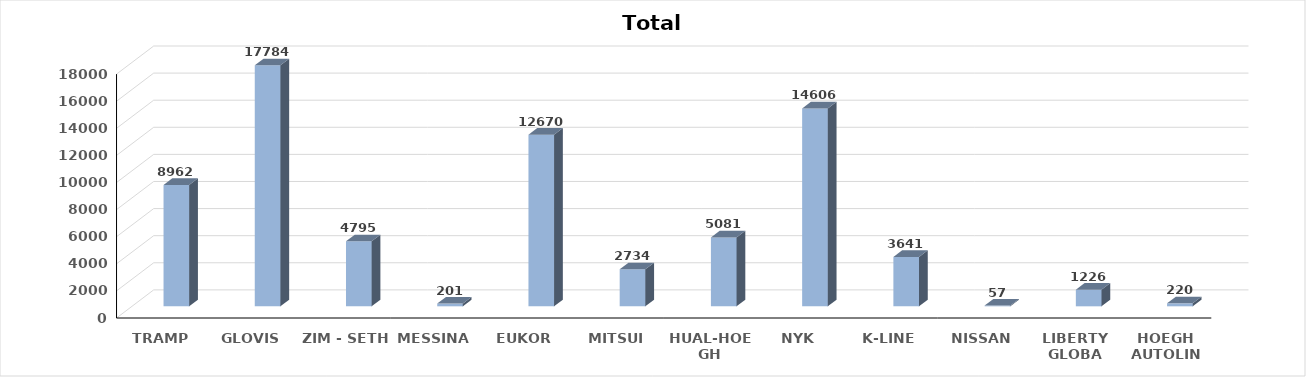
| Category | Series 0 |
|---|---|
| TRAMP | 8962 |
| GLOVIS | 17784 |
| ZIM - SETH | 4795 |
| MESSINA | 201 |
| EUKOR | 12670 |
| MITSUI | 2734 |
| HUAL-HOEGH | 5081 |
| NYK | 14606 |
| K-LINE | 3641 |
| NISSAN | 57 |
| LIBERTY GLOBA | 1226 |
| HOEGH AUTOLIN | 220 |